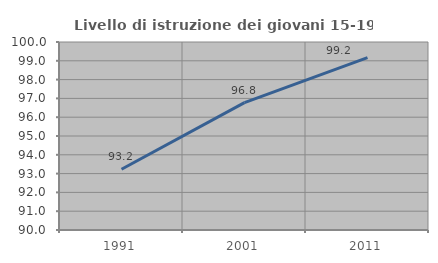
| Category | Livello di istruzione dei giovani 15-19 anni |
|---|---|
| 1991.0 | 93.233 |
| 2001.0 | 96.774 |
| 2011.0 | 99.167 |